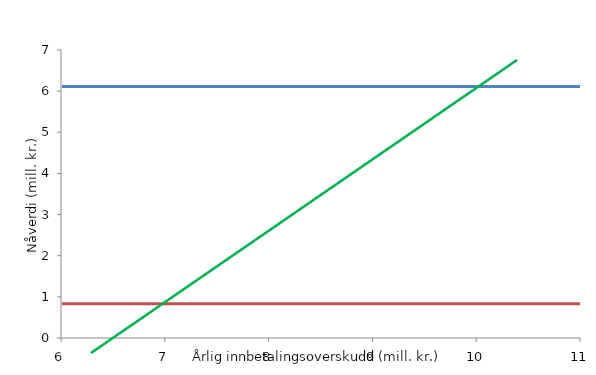
| Category | Series 0 | Series 1 |
|---|---|---|
| 6.0 | 6.11 | 0.83 |
| 7.0 | 6.11 | 0.83 |
| 8.0 | 6.11 | 0.83 |
| 9.0 | 6.11 | 0.83 |
| 10.0 | 6.11 | 0.83 |
| 11.0 | 6.11 | 0.83 |